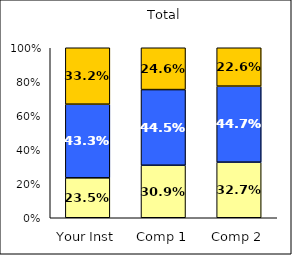
| Category | Low Academic Adjustment | Average Academic Adjustment | High Academic Adjustment |
|---|---|---|---|
| Your Inst | 0.235 | 0.433 | 0.332 |
| Comp 1 | 0.309 | 0.445 | 0.246 |
| Comp 2 | 0.327 | 0.447 | 0.226 |